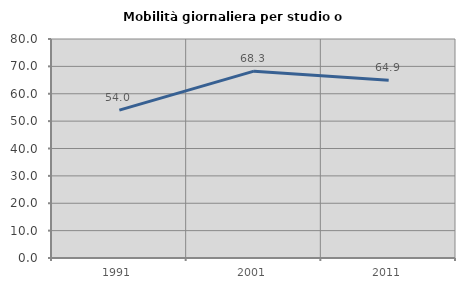
| Category | Mobilità giornaliera per studio o lavoro |
|---|---|
| 1991.0 | 54.009 |
| 2001.0 | 68.261 |
| 2011.0 | 64.935 |